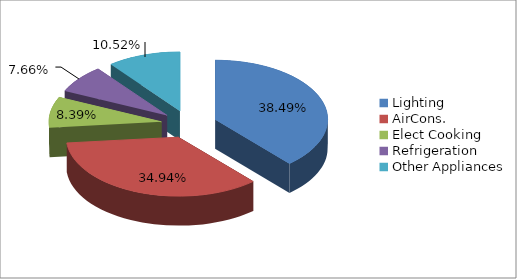
| Category | Series 0 |
|---|---|
| Lighting | 0.385 |
| AirCons. | 0.349 |
| Elect Cooking | 0.084 |
| Refrigeration | 0.077 |
| Other Appliances | 0.105 |